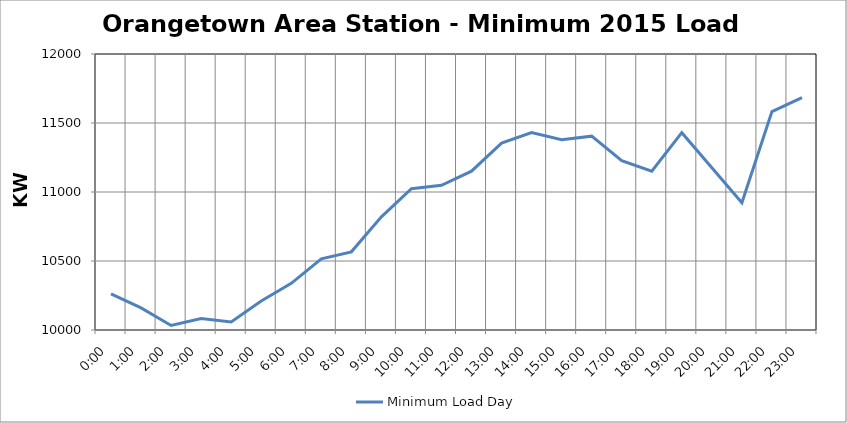
| Category | Minimum Load Day |
|---|---|
| 0.0 | 10261.6 |
| 0.041666666666666664 | 10160 |
| 0.08333333333333333 | 10033 |
| 0.125 | 10083.8 |
| 0.16666666666666666 | 10058.4 |
| 0.20833333333333334 | 10210.8 |
| 0.25 | 10337.8 |
| 0.2916666666666667 | 10515.6 |
| 0.3333333333333333 | 10566.4 |
| 0.375 | 10820.4 |
| 0.4166666666666667 | 11023.6 |
| 0.4583333333333333 | 11049 |
| 0.5 | 11150.6 |
| 0.5416666666666666 | 11353.8 |
| 0.5833333333333334 | 11430 |
| 0.625 | 11379.2 |
| 0.6666666666666666 | 11404.6 |
| 0.7083333333333334 | 11226.8 |
| 0.75 | 11150.6 |
| 0.7916666666666666 | 11430 |
| 0.8333333333333334 | 11176 |
| 0.875 | 10922 |
| 0.9166666666666666 | 11582.4 |
| 0.9583333333333334 | 11684 |